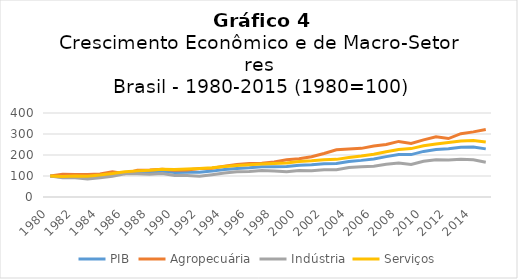
| Category | PIB | Agropecuária | Indústria | Serviços |
|---|---|---|---|---|
| 1980.0 | 100 | 100 | 100 | 100 |
| 1981.0 | 95.75 | 107.97 | 91.16 | 97.52 |
| 1982.0 | 96.545 | 107.732 | 91.124 | 99.578 |
| 1983.0 | 93.716 | 107.237 | 85.729 | 99.05 |
| 1984.0 | 98.777 | 110.057 | 91.139 | 104.349 |
| 1985.0 | 106.531 | 120.601 | 98.676 | 111.591 |
| 1986.0 | 114.51 | 110.929 | 110.181 | 120.63 |
| 1987.0 | 118.552 | 127.535 | 111.272 | 124.418 |
| 1988.0 | 118.481 | 128.606 | 108.379 | 127.316 |
| 1989.0 | 122.225 | 132.271 | 111.479 | 131.823 |
| 1990.0 | 116.908 | 127.351 | 102.36 | 130.822 |
| 1991.0 | 118.112 | 129.095 | 102.626 | 133.386 |
| 1992.0 | 117.474 | 135.408 | 98.295 | 135.413 |
| 1993.0 | 123.254 | 136.749 | 106.218 | 139.692 |
| 1994.0 | 130.464 | 146.923 | 114.768 | 145.308 |
| 1995.0 | 135.97 | 155.356 | 120.185 | 149.9 |
| 1996.0 | 138.975 | 159.939 | 121.351 | 153.347 |
| 1997.0 | 143.686 | 161.235 | 126.654 | 157.227 |
| 1998.0 | 144.175 | 166.733 | 124.007 | 159.46 |
| 1999.0 | 144.852 | 177.62 | 120.77 | 162.362 |
| 2000.0 | 151.211 | 182.452 | 126.096 | 168.613 |
| 2001.0 | 153.313 | 191.939 | 125.289 | 172.086 |
| 2002.0 | 157.989 | 207.333 | 130.05 | 177.455 |
| 2003.0 | 159.79 | 224.562 | 130.18 | 179.212 |
| 2004.0 | 168.994 | 229.053 | 140.868 | 188.191 |
| 2005.0 | 174.402 | 231.619 | 143.671 | 195.078 |
| 2006.0 | 181.308 | 242.366 | 146.559 | 203.525 |
| 2007.0 | 192.314 | 250.243 | 155.661 | 215.391 |
| 2008.0 | 202.103 | 264.682 | 162.043 | 225.773 |
| 2009.0 | 201.84 | 254.809 | 154.427 | 230.446 |
| 2010.0 | 217.038 | 271.881 | 170.178 | 243.812 |
| 2011.0 | 225.655 | 287.215 | 177.172 | 252.248 |
| 2012.0 | 229.987 | 278.369 | 175.897 | 259.563 |
| 2013.0 | 236.887 | 301.641 | 179.714 | 266.701 |
| 2014.0 | 238.072 | 310.056 | 177 | 269.341 |
| 2015.0 | 229.096 | 321.249 | 165.796 | 262.069 |